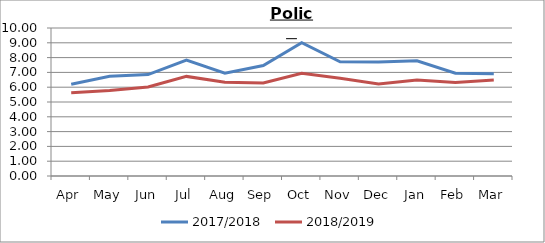
| Category | 2017/2018 | 2018/2019 |
|---|---|---|
| Apr | 6.2 | 5.62 |
| May | 6.74 | 5.78 |
| Jun | 6.85 | 6.01 |
| Jul | 7.83 | 6.73 |
| Aug | 6.94 | 6.34 |
| Sep | 7.46 | 6.29 |
| Oct | 9.01 | 6.94 |
| Nov | 7.72 | 6.6 |
| Dec | 7.71 | 6.21 |
| Jan | 7.78 | 6.49 |
| Feb | 6.95 | 6.32 |
| Mar | 6.91 | 6.49 |